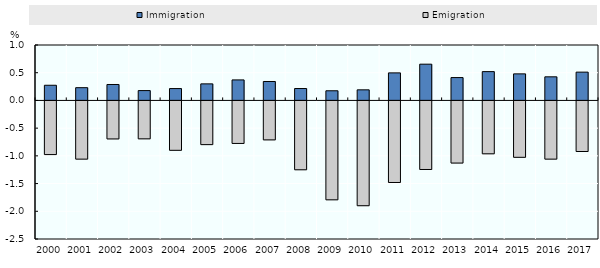
| Category | Immigration | Emigration |
|---|---|---|
| 2000.0 | 0.274 | -0.968 |
| 2001.0 | 0.23 | -1.05 |
| 2002.0 | 0.288 | -0.686 |
| 2003.0 | 0.178 | -0.684 |
| 2004.0 | 0.214 | -0.891 |
| 2005.0 | 0.299 | -0.788 |
| 2006.0 | 0.37 | -0.767 |
| 2007.0 | 0.342 | -0.703 |
| 2008.0 | 0.215 | -1.242 |
| 2009.0 | 0.174 | -1.784 |
| 2010.0 | 0.191 | -1.89 |
| 2011.0 | 0.497 | -1.472 |
| 2012.0 | 0.654 | -1.237 |
| 2013.0 | 0.412 | -1.121 |
| 2014.0 | 0.52 | -0.954 |
| 2015.0 | 0.479 | -1.017 |
| 2016.0 | 0.426 | -1.05 |
| 2017.0 | 0.511 | -0.913 |